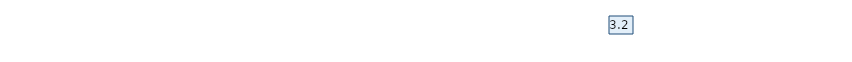
| Category | Итоговая оценка |
|---|---|
| Вопрос 1 | 3.2 |